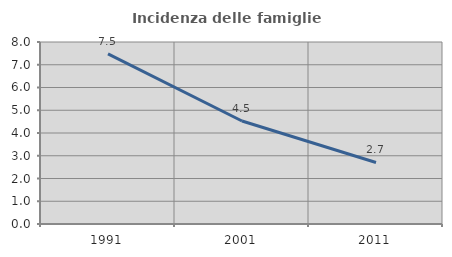
| Category | Incidenza delle famiglie numerose |
|---|---|
| 1991.0 | 7.481 |
| 2001.0 | 4.527 |
| 2011.0 | 2.705 |